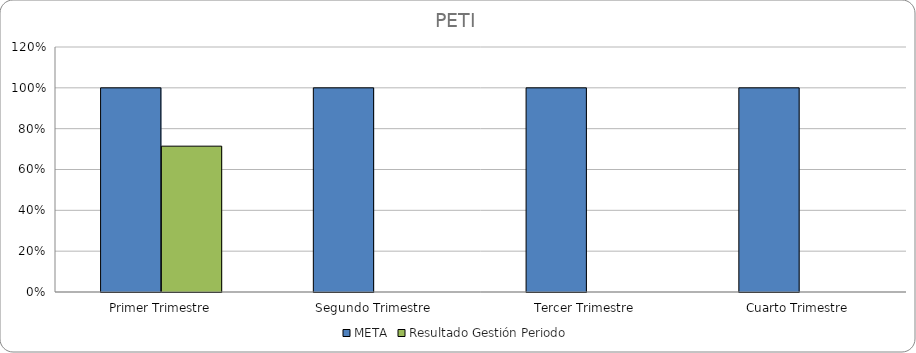
| Category | META | Resultado Gestión Periodo |
|---|---|---|
| Primer Trimestre | 1 | 0.714 |
| Segundo Trimestre | 1 | 0 |
| Tercer Trimestre | 1 | 0 |
| Cuarto Trimestre | 1 | 0 |